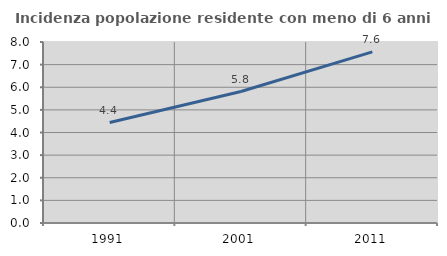
| Category | Incidenza popolazione residente con meno di 6 anni |
|---|---|
| 1991.0 | 4.44 |
| 2001.0 | 5.812 |
| 2011.0 | 7.565 |